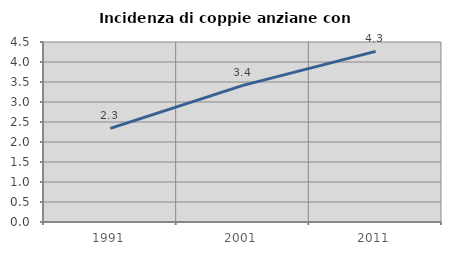
| Category | Incidenza di coppie anziane con figli |
|---|---|
| 1991.0 | 2.341 |
| 2001.0 | 3.416 |
| 2011.0 | 4.265 |